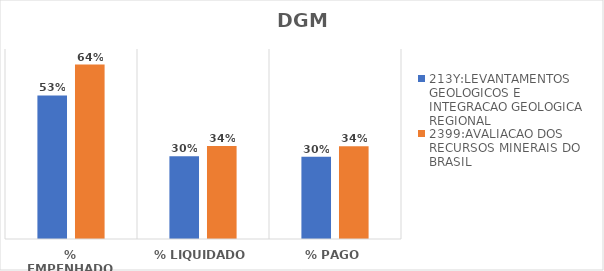
| Category | 213Y:LEVANTAMENTOS GEOLOGICOS E INTEGRACAO GEOLOGICA REGIONAL | 2399:AVALIACAO DOS RECURSOS MINERAIS DO BRASIL |
|---|---|---|
| % EMPENHADO | 0.529 | 0.642 |
| % LIQUIDADO | 0.305 | 0.342 |
| % PAGO | 0.303 | 0.342 |